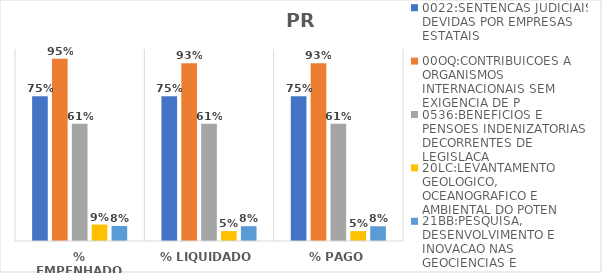
| Category | 0022:SENTENCAS JUDICIAIS DEVIDAS POR EMPRESAS ESTATAIS | 00OQ:CONTRIBUICOES A ORGANISMOS INTERNACIONAIS SEM EXIGENCIA DE P | 0536:BENEFICIOS E PENSOES INDENIZATORIAS DECORRENTES DE LEGISLACA | 20LC:LEVANTAMENTO GEOLOGICO, OCEANOGRAFICO E AMBIENTAL DO POTEN | 21BB:PESQUISA, DESENVOLVIMENTO E INOVACAO NAS GEOCIENCIAS E |
|---|---|---|---|---|---|
| % EMPENHADO | 0.754 | 0.95 | 0.611 | 0.086 | 0.078 |
| % LIQUIDADO | 0.754 | 0.926 | 0.611 | 0.052 | 0.077 |
| % PAGO | 0.754 | 0.926 | 0.611 | 0.052 | 0.077 |